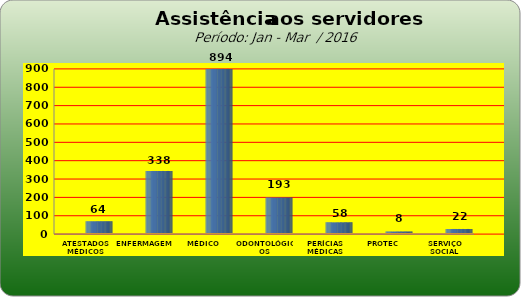
| Category | Series 0 |
|---|---|
| ATESTADOS MÉDICOS | 64 |
| ENFERMAGEM | 338 |
| MÉDICO | 894 |
| ODONTOLÓGICOS | 193 |
| PERÍCIAS MÉDICAS | 58 |
| PROTEC | 8 |
| SERVIÇO SOCIAL | 22 |